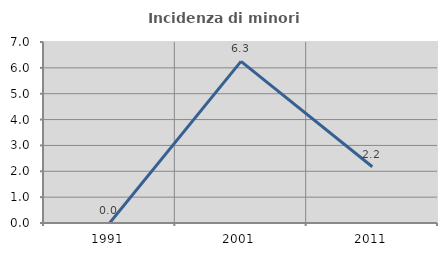
| Category | Incidenza di minori stranieri |
|---|---|
| 1991.0 | 0 |
| 2001.0 | 6.25 |
| 2011.0 | 2.174 |